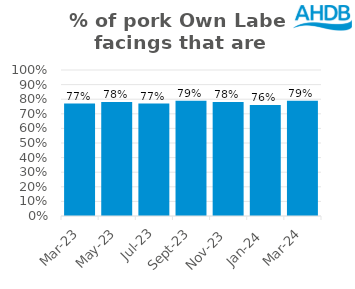
| Category | Pork |
|---|---|
| 2023-03-01 | 0.77 |
| 2023-05-01 | 0.78 |
| 2023-07-01 | 0.77 |
| 2023-09-01 | 0.79 |
| 2023-11-01 | 0.78 |
| 2024-01-01 | 0.76 |
| 2024-03-01 | 0.79 |